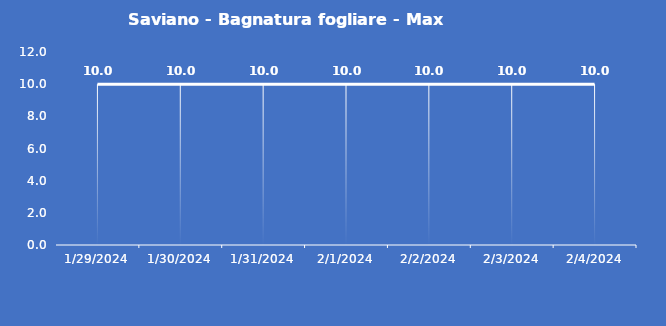
| Category | Saviano - Bagnatura fogliare - Max (min) |
|---|---|
| 1/29/24 | 10 |
| 1/30/24 | 10 |
| 1/31/24 | 10 |
| 2/1/24 | 10 |
| 2/2/24 | 10 |
| 2/3/24 | 10 |
| 2/4/24 | 10 |